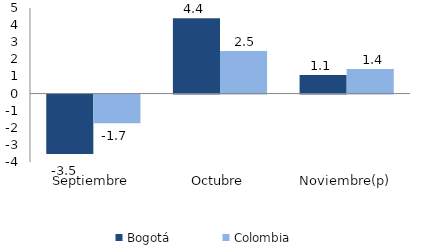
| Category | Bogotá | Colombia |
|---|---|---|
| Septiembre | -3.471 | -1.672 |
| Octubre | 4.395 | 2.488 |
| Noviembre(p) | 1.078 | 1.436 |